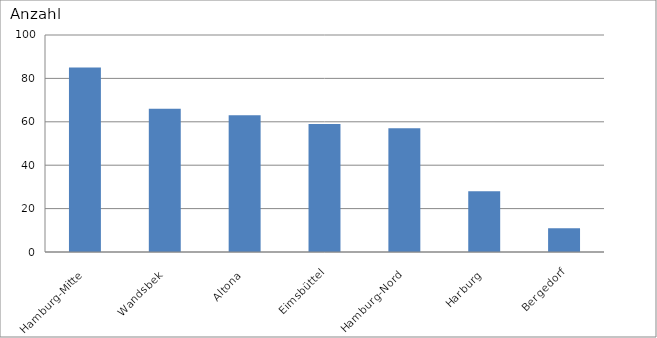
| Category | Hamburg-Mitte |
|---|---|
| Hamburg-Mitte | 85 |
| Wandsbek | 66 |
| Altona | 63 |
| Eimsbüttel | 59 |
| Hamburg-Nord | 57 |
| Harburg | 28 |
| Bergedorf | 11 |